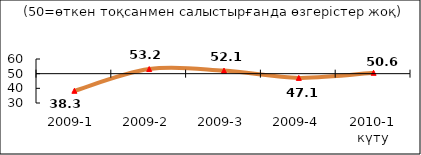
| Category | Диф.индекс ↓ |
|---|---|
| 2009-1 | 38.315 |
| 2009-2 | 53.16 |
| 2009-3 | 52.08 |
| 2009-4 | 47.12 |
| 2010-1 күту | 50.575 |